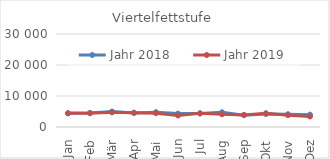
| Category | Jahr 2018 | Jahr 2019 |
|---|---|---|
| 0 | 4355.664 | 4477.547 |
| 1 | 4556.105 | 4440.382 |
| 2 | 5004.075 | 4720.146 |
| 3 | 4490.549 | 4623.95 |
| 4 | 4796.226 | 4458.55 |
| 5 | 4320.37 | 3715.298 |
| 6 | 4378.407 | 4418.263 |
| 7 | 4742.983 | 4103.87 |
| 8 | 3829.744 | 3902.765 |
| 9 | 4212.178 | 4449.968 |
| 10 | 4121.41 | 3805.442 |
| 11 | 3984.764 | 3395.941 |